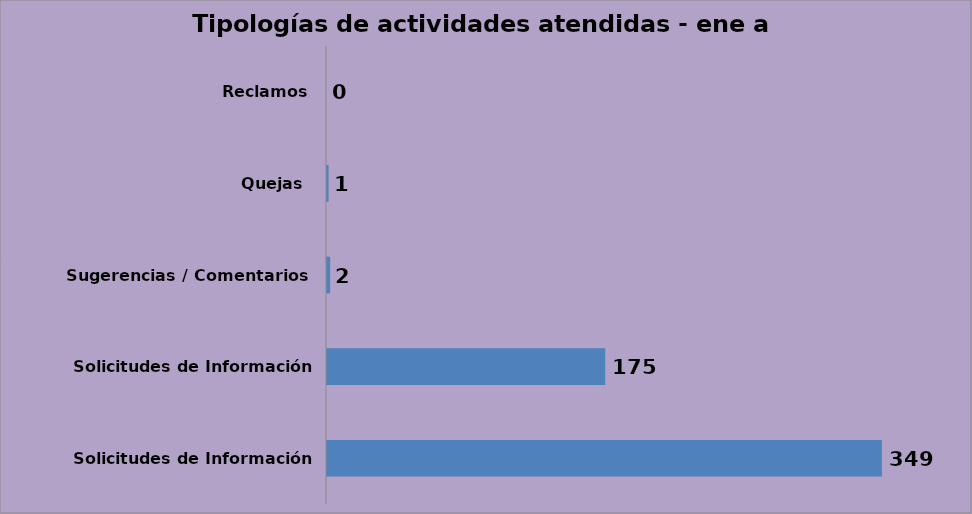
| Category | Series 0 |
|---|---|
| Solicitudes de Información Oficiosa | 349 |
| Solicitudes de Información Especifica | 175 |
| Sugerencias / Comentarios | 2 |
| Quejas  | 1 |
| Reclamos | 0 |